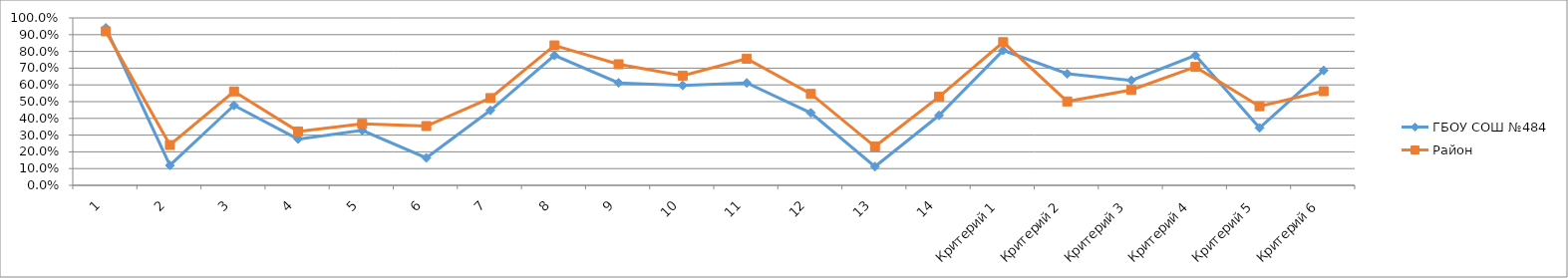
| Category | ГБОУ СОШ №484 | Район |
|---|---|---|
| 1 | 0.94 | 0.92 |
| 2 | 0.119 | 0.241 |
| 3 | 0.478 | 0.561 |
| 4 | 0.276 | 0.322 |
| 5 | 0.328 | 0.368 |
| 6 | 0.164 | 0.354 |
| 7 | 0.448 | 0.521 |
| 8 | 0.776 | 0.836 |
| 9 | 0.612 | 0.723 |
| 10 | 0.597 | 0.655 |
| 11 | 0.612 | 0.756 |
| 12 | 0.433 | 0.546 |
| 13 | 0.112 | 0.232 |
| 14 | 0.418 | 0.529 |
| Критерий 1 | 0.806 | 0.855 |
| Критерий 2 | 0.667 | 0.501 |
| Критерий 3 | 0.627 | 0.57 |
| Критерий 4 | 0.776 | 0.707 |
| Критерий 5 | 0.343 | 0.472 |
| Критерий 6 | 0.687 | 0.562 |